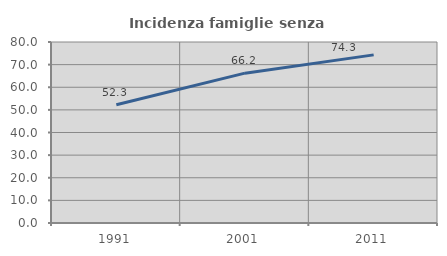
| Category | Incidenza famiglie senza nuclei |
|---|---|
| 1991.0 | 52.258 |
| 2001.0 | 66.234 |
| 2011.0 | 74.306 |